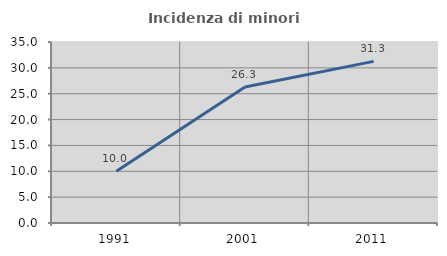
| Category | Incidenza di minori stranieri |
|---|---|
| 1991.0 | 10 |
| 2001.0 | 26.316 |
| 2011.0 | 31.25 |